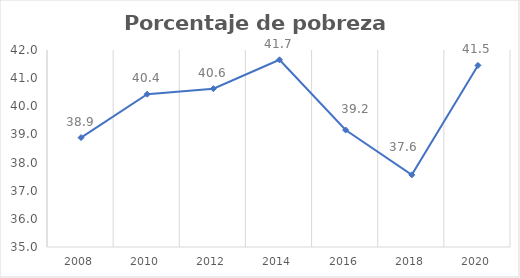
| Category | Series 0 |
|---|---|
| 2008.0 | 38.888 |
| 2010.0 | 40.431 |
| 2012.0 | 40.626 |
| 2014.0 | 41.652 |
| 2016.0 | 39.157 |
| 2018.0 | 37.564 |
| 2020.0 | 41.452 |